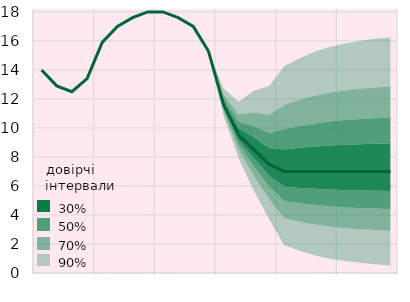
| Category | Series 8 | Series 11 |
|---|---|---|
|  | 14 |  |
|  | 12.9 |  |
|  | 12.5 |  |
| IV.17 | 13.4 |  |
|  | 15.9 |  |
|  | 17 |  |
|  | 17.6 |  |
| IV.18 | 18 |  |
|  | 18 |  |
|  | 17.6 |  |
|  | 17 |  |
| IV.19 | 15.3 |  |
|  | 11.6 |  |
|  | 9.5 |  |
|  | 8.5 |  |
| IV.20 | 7.5 |  |
|  | 7 |  |
|  | 7 |  |
|  | 7 |  |
| IV.21 | 7 |  |
|  | 7 |  |
|  | 7 |  |
|  | 7 |  |
| IV.22 | 7 |  |